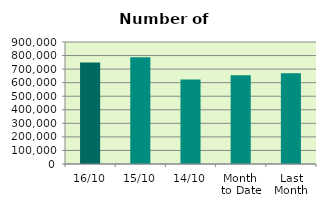
| Category | Series 0 |
|---|---|
| 16/10 | 749584 |
| 15/10 | 786798 |
| 14/10 | 623836 |
| Month 
to Date | 654747.333 |
| Last
Month | 670189.636 |